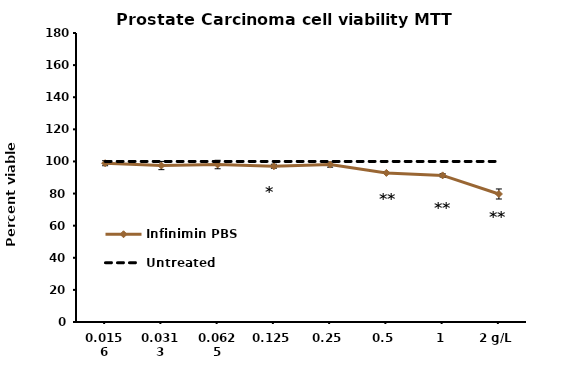
| Category | Infinimin PBS | Untreated |
|---|---|---|
| 0.0156 | 98.898 | 100 |
| 0.0313 | 97.458 | 100 |
| 0.0625 | 98.088 | 100 |
| 0.125 | 97.008 | 100 |
| 0.25 | 98.043 | 100 |
| 0.5 | 92.868 | 100 |
| 1 | 91.316 | 100 |
| 2 g/L | 79.73 | 100 |